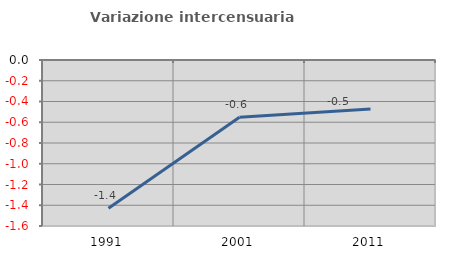
| Category | Variazione intercensuaria annua |
|---|---|
| 1991.0 | -1.429 |
| 2001.0 | -0.552 |
| 2011.0 | -0.471 |